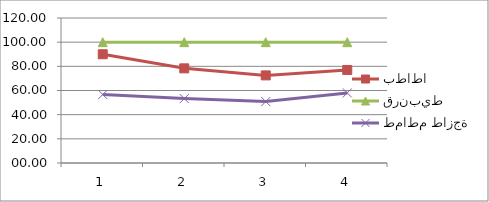
| Category | بطاطا | قرنبيط | طماطم طازجة |
|---|---|---|---|
| 0 | 90 | 100 | 56.67 |
| 1 | 78.33 | 100 | 53.33 |
| 2 | 72.5 | 100 | 50.83 |
| 3 | 77 | 100 | 58 |